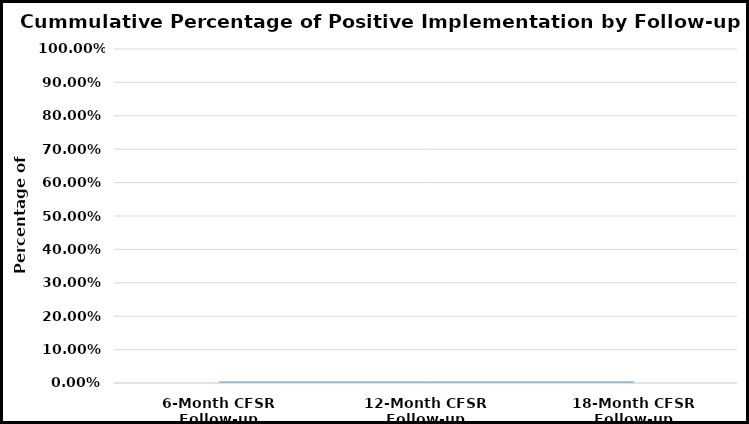
| Category | Series 0 | Series 1 |
|---|---|---|
| 6-Month CFSR Follow-up | 0 |  |
| 12-Month CFSR Follow-up | 0 |  |
| 18-Month CFSR Follow-up | 0 |  |